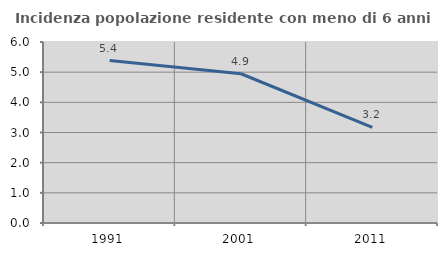
| Category | Incidenza popolazione residente con meno di 6 anni |
|---|---|
| 1991.0 | 5.385 |
| 2001.0 | 4.948 |
| 2011.0 | 3.17 |